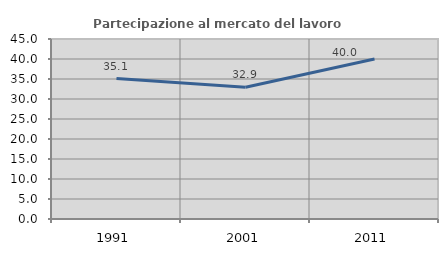
| Category | Partecipazione al mercato del lavoro  femminile |
|---|---|
| 1991.0 | 35.096 |
| 2001.0 | 32.944 |
| 2011.0 | 39.984 |